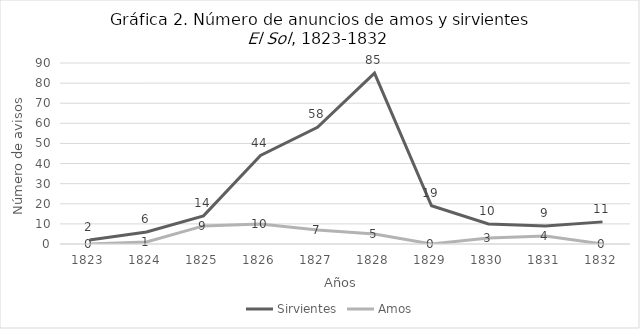
| Category | Sirvientes  | Amos  |
|---|---|---|
| 1823.0 | 2 | 0 |
| 1824.0 | 6 | 1 |
| 1825.0 | 14 | 9 |
| 1826.0 | 44 | 10 |
| 1827.0 | 58 | 7 |
| 1828.0 | 85 | 5 |
| 1829.0 | 19 | 0 |
| 1830.0 | 10 | 3 |
| 1831.0 | 9 | 4 |
| 1832.0 | 11 | 0 |